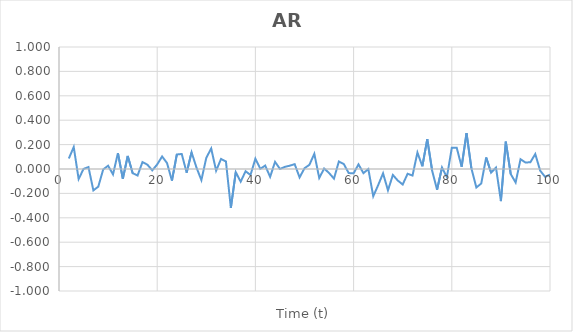
| Category | Series 0 |
|---|---|
| 2.0 | 0.086 |
| 3.0 | 0.18 |
| 4.0 | -0.082 |
| 5.0 | 0.001 |
| 6.0 | 0.016 |
| 7.0 | -0.175 |
| 8.0 | -0.145 |
| 9.0 | -0.004 |
| 10.0 | 0.027 |
| 11.0 | -0.044 |
| 12.0 | 0.13 |
| 13.0 | -0.08 |
| 14.0 | 0.107 |
| 15.0 | -0.034 |
| 16.0 | -0.054 |
| 17.0 | 0.057 |
| 18.0 | 0.036 |
| 19.0 | -0.011 |
| 20.0 | 0.037 |
| 21.0 | 0.103 |
| 22.0 | 0.049 |
| 23.0 | -0.095 |
| 24.0 | 0.119 |
| 25.0 | 0.123 |
| 26.0 | -0.03 |
| 27.0 | 0.137 |
| 28.0 | 0.012 |
| 29.0 | -0.091 |
| 30.0 | 0.092 |
| 31.0 | 0.168 |
| 32.0 | -0.014 |
| 33.0 | 0.082 |
| 34.0 | 0.062 |
| 35.0 | -0.319 |
| 36.0 | -0.026 |
| 37.0 | -0.104 |
| 38.0 | -0.018 |
| 39.0 | -0.049 |
| 40.0 | 0.085 |
| 41.0 | 0.002 |
| 42.0 | 0.028 |
| 43.0 | -0.064 |
| 44.0 | 0.059 |
| 45.0 | 0.001 |
| 46.0 | 0.017 |
| 47.0 | 0.027 |
| 48.0 | 0.04 |
| 49.0 | -0.069 |
| 50.0 | 0.006 |
| 51.0 | 0.035 |
| 52.0 | 0.125 |
| 53.0 | -0.074 |
| 54.0 | 0.004 |
| 55.0 | -0.033 |
| 56.0 | -0.079 |
| 57.0 | 0.062 |
| 58.0 | 0.041 |
| 59.0 | -0.033 |
| 60.0 | -0.036 |
| 61.0 | 0.038 |
| 62.0 | -0.034 |
| 63.0 | 0 |
| 64.0 | -0.223 |
| 65.0 | -0.133 |
| 66.0 | -0.036 |
| 67.0 | -0.175 |
| 68.0 | -0.049 |
| 69.0 | -0.095 |
| 70.0 | -0.127 |
| 71.0 | -0.039 |
| 72.0 | -0.054 |
| 73.0 | 0.135 |
| 74.0 | 0.022 |
| 75.0 | 0.245 |
| 76.0 | -0.014 |
| 77.0 | -0.17 |
| 78.0 | 0.012 |
| 79.0 | -0.067 |
| 80.0 | 0.174 |
| 81.0 | 0.175 |
| 82.0 | 0.018 |
| 83.0 | 0.294 |
| 84.0 | 0.003 |
| 85.0 | -0.152 |
| 86.0 | -0.119 |
| 87.0 | 0.095 |
| 88.0 | -0.029 |
| 89.0 | 0.012 |
| 90.0 | -0.263 |
| 91.0 | 0.224 |
| 92.0 | -0.041 |
| 93.0 | -0.111 |
| 94.0 | 0.08 |
| 95.0 | 0.053 |
| 96.0 | 0.055 |
| 97.0 | 0.123 |
| 98.0 | -0.014 |
| 99.0 | -0.064 |
| 100.0 | -0.046 |